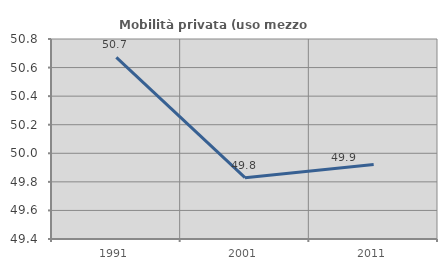
| Category | Mobilità privata (uso mezzo privato) |
|---|---|
| 1991.0 | 50.671 |
| 2001.0 | 49.829 |
| 2011.0 | 49.921 |